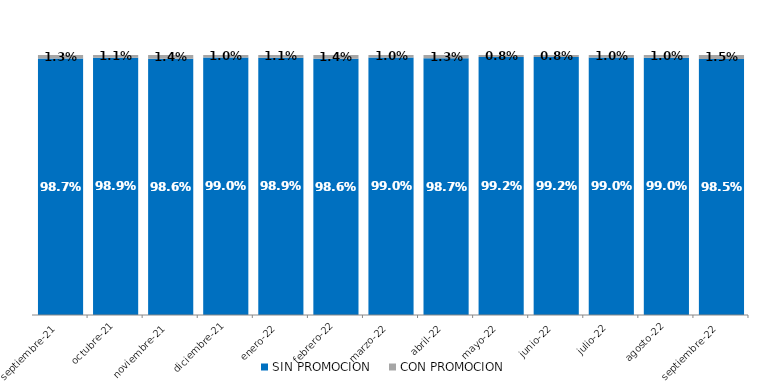
| Category | SIN PROMOCION   | CON PROMOCION   |
|---|---|---|
| 2021-09-01 | 0.987 | 0.013 |
| 2021-10-01 | 0.989 | 0.011 |
| 2021-11-01 | 0.986 | 0.014 |
| 2021-12-01 | 0.99 | 0.01 |
| 2022-01-01 | 0.989 | 0.011 |
| 2022-02-01 | 0.986 | 0.014 |
| 2022-03-01 | 0.99 | 0.01 |
| 2022-04-01 | 0.987 | 0.013 |
| 2022-05-01 | 0.992 | 0.008 |
| 2022-06-01 | 0.992 | 0.008 |
| 2022-07-01 | 0.99 | 0.01 |
| 2022-08-01 | 0.99 | 0.01 |
| 2022-09-01 | 0.985 | 0.015 |